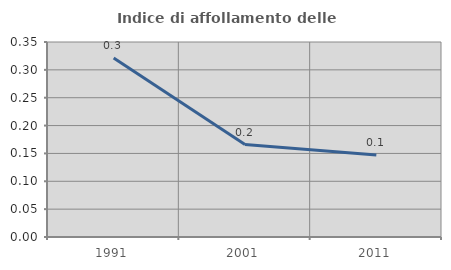
| Category | Indice di affollamento delle abitazioni  |
|---|---|
| 1991.0 | 0.321 |
| 2001.0 | 0.166 |
| 2011.0 | 0.147 |